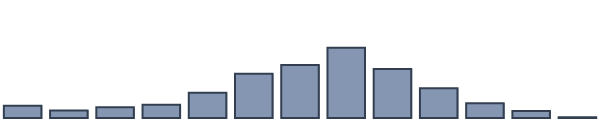
| Category | Series 0 |
|---|---|
| 0 | 3.6 |
| 1 | 2.2 |
| 2 | 3.2 |
| 3 | 3.9 |
| 4 | 7.5 |
| 5 | 13.1 |
| 6 | 15.7 |
| 7 | 20.8 |
| 8 | 14.5 |
| 9 | 8.8 |
| 10 | 4.4 |
| 11 | 2.1 |
| 12 | 0.2 |